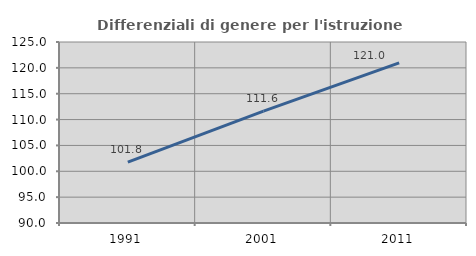
| Category | Differenziali di genere per l'istruzione superiore |
|---|---|
| 1991.0 | 101.786 |
| 2001.0 | 111.625 |
| 2011.0 | 120.959 |